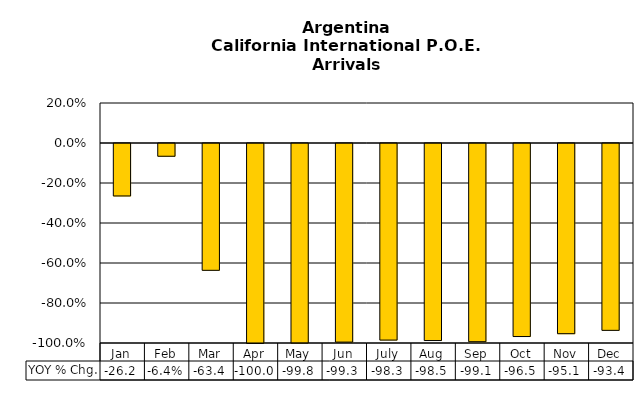
| Category | YOY % Chg. |
|---|---|
| Jan | -0.262 |
| Feb | -0.064 |
| Mar | -0.634 |
| Apr | -1 |
| May | -0.998 |
| Jun | -0.993 |
| July | -0.983 |
| Aug | -0.985 |
| Sep | -0.991 |
| Oct | -0.965 |
| Nov | -0.951 |
| Dec | -0.934 |